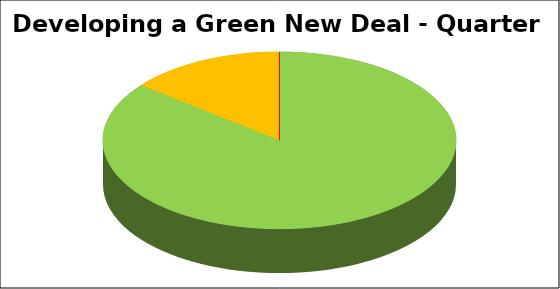
| Category | Series 0 |
|---|---|
| Green | 0.857 |
| Amber | 0.143 |
| Red | 0 |